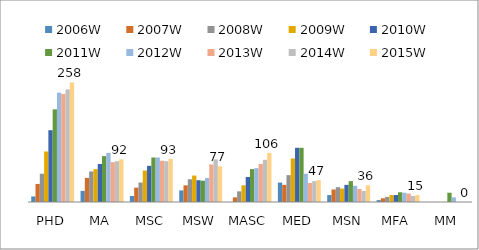
| Category | 2006W | 2007W | 2008W | 2009W | 2010W | 2011W | 2012W | 2013W | 2014W | 2015W |
|---|---|---|---|---|---|---|---|---|---|---|
| PHD | 12 | 39 | 61 | 109 | 155 | 200 | 236 | 233 | 243 | 258 |
| MA | 24 | 52 | 66 | 71 | 82 | 99 | 106 | 86 | 88 | 92 |
| MSC | 13 | 31 | 42 | 68 | 78 | 96 | 96 | 89 | 88 | 93 |
| MSW | 25 | 36 | 49 | 57 | 47 | 46 | 52 | 81 | 92 | 77 |
| MASC | 0 | 10 | 23 | 36 | 54 | 71 | 73 | 82 | 91 | 106 |
| MED | 42 | 37 | 58 | 94 | 117 | 117 | 61 | 41 | 45 | 47 |
| MSN | 15 | 27 | 32 | 29 | 37 | 45 | 35 | 28 | 24 | 36 |
| MFA | 4 | 8 | 11 | 15 | 15 | 21 | 20 | 18 | 13 | 15 |
| MM | 0 | 0 | 0 | 0 | 0 | 20 | 10 | 0 | 0 | 0 |